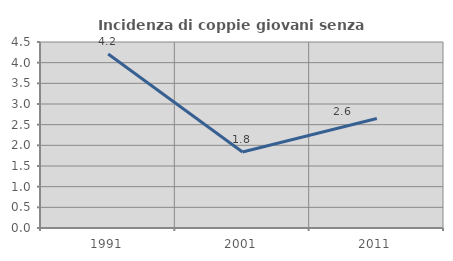
| Category | Incidenza di coppie giovani senza figli |
|---|---|
| 1991.0 | 4.211 |
| 2001.0 | 1.84 |
| 2011.0 | 2.649 |